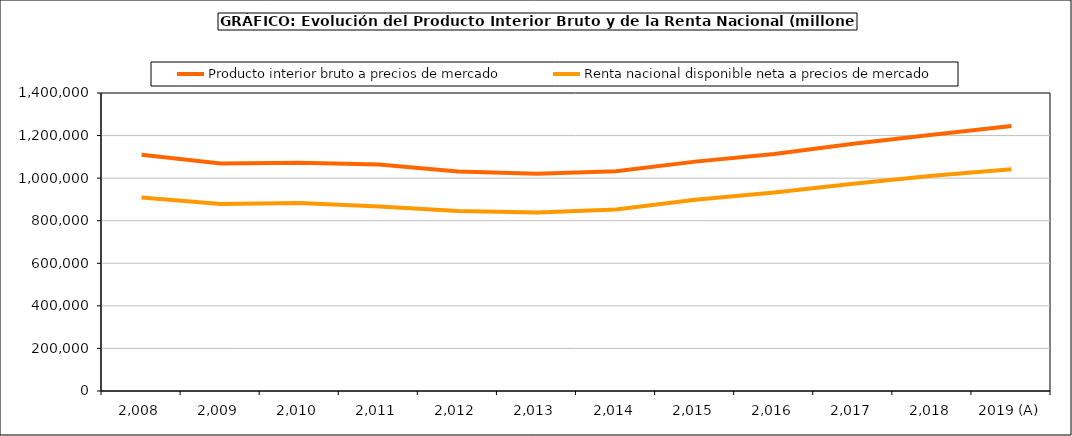
| Category | Producto interior bruto a precios de mercado | Renta nacional disponible neta a precios de mercado |
|---|---|---|
| 2,008 | 1109541 | 909437 |
| 2,009 | 1069323 | 878214 |
| 2,010 | 1072709 | 882934 |
| 2,011 | 1063763 | 867238 |
| 2,012 | 1031099 | 845973 |
| 2,013 | 1020348 | 838494 |
| 2,014 | 1032158 | 853217 |
| 2,015 | 1077590 | 897955 |
| 2,016 | 1113840 | 932147 |
| 2,017 | 1161867 | 974106 |
| 2,018 | 1204241 | 1010794 |
| 2019 (A) | 1244772 | 1042316 |